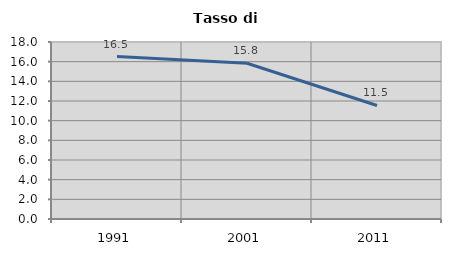
| Category | Tasso di disoccupazione   |
|---|---|
| 1991.0 | 16.522 |
| 2001.0 | 15.835 |
| 2011.0 | 11.543 |